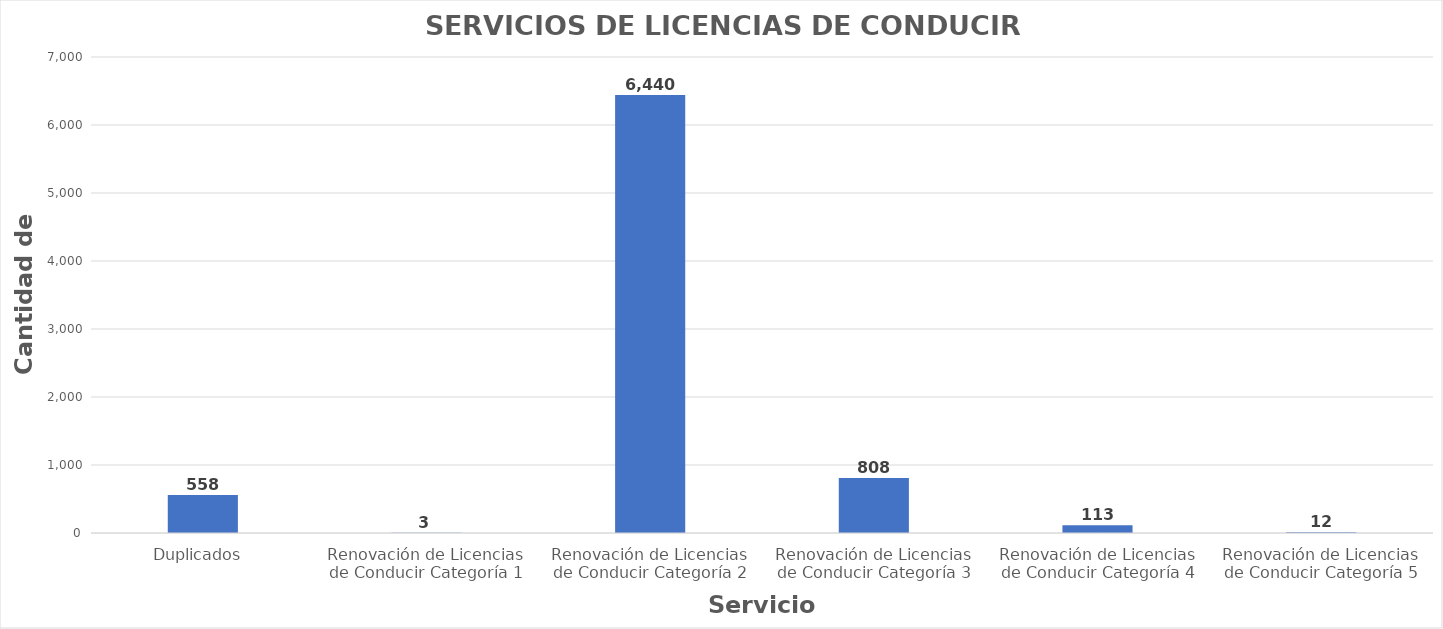
| Category | Series 0 |
|---|---|
| Duplicados  | 558 |
| Renovación de Licencias de Conducir Categoría 1 | 3 |
| Renovación de Licencias de Conducir Categoría 2 | 6440 |
| Renovación de Licencias de Conducir Categoría 3 | 808 |
| Renovación de Licencias de Conducir Categoría 4 | 113 |
| Renovación de Licencias de Conducir Categoría 5 | 12 |